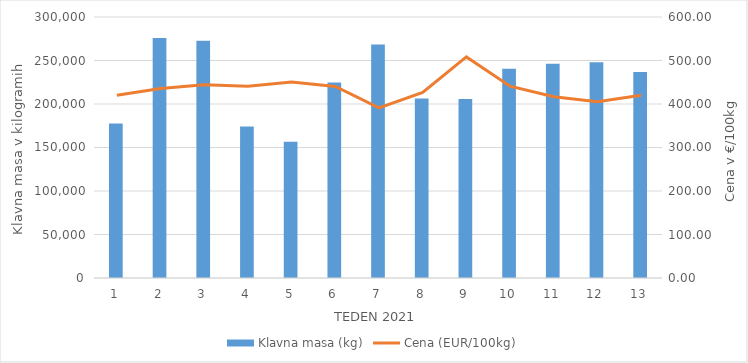
| Category | Klavna masa (kg) |
|---|---|
| 1.0 | 177573 |
| 2.0 | 275951 |
| 3.0 | 272797 |
| 4.0 | 174056 |
| 5.0 | 156508 |
| 6.0 | 224595 |
| 7.0 | 268436 |
| 8.0 | 206193 |
| 9.0 | 205669 |
| 10.0 | 240592 |
| 11.0 | 246325 |
| 12.0 | 248020 |
| 13.0 | 236703 |